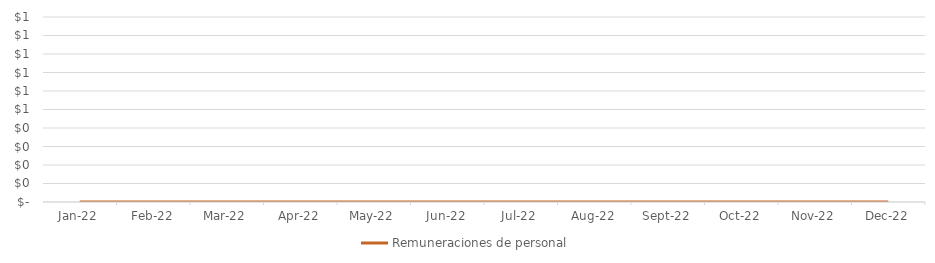
| Category | Remuneraciones de personal |
|---|---|
| 2022-01-01 | 0 |
| 2022-02-01 | 0 |
| 2022-03-01 | 0 |
| 2022-04-01 | 0 |
| 2022-05-01 | 0 |
| 2022-06-01 | 0 |
| 2022-07-01 | 0 |
| 2022-08-01 | 0 |
| 2022-09-01 | 0 |
| 2022-10-01 | 0 |
| 2022-11-01 | 0 |
| 2022-12-01 | 0 |